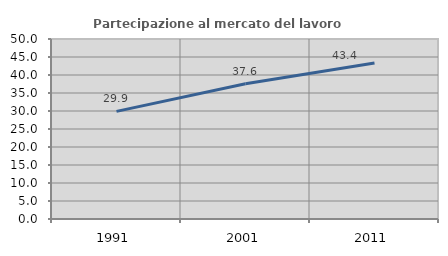
| Category | Partecipazione al mercato del lavoro  femminile |
|---|---|
| 1991.0 | 29.899 |
| 2001.0 | 37.565 |
| 2011.0 | 43.351 |